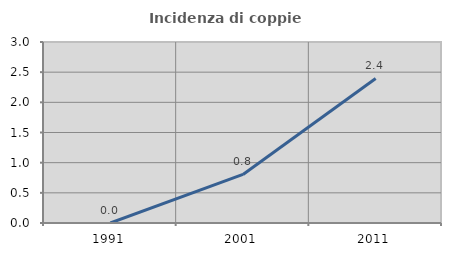
| Category | Incidenza di coppie miste |
|---|---|
| 1991.0 | 0 |
| 2001.0 | 0.805 |
| 2011.0 | 2.395 |